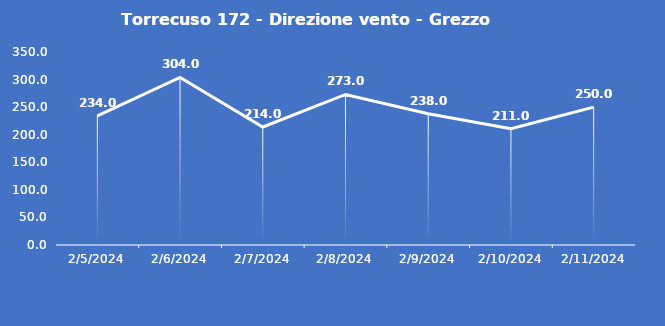
| Category | Torrecuso 172 - Direzione vento - Grezzo (°N) |
|---|---|
| 2/5/24 | 234 |
| 2/6/24 | 304 |
| 2/7/24 | 214 |
| 2/8/24 | 273 |
| 2/9/24 | 238 |
| 2/10/24 | 211 |
| 2/11/24 | 250 |